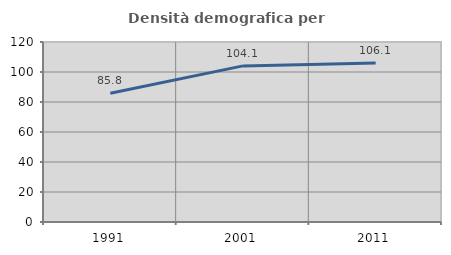
| Category | Densità demografica |
|---|---|
| 1991.0 | 85.824 |
| 2001.0 | 104.068 |
| 2011.0 | 106.068 |